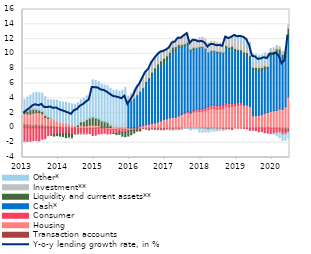
| Category | Transaction accounts | Housing | Consumer | Cash* | Liquidity and current assets** | Investment** | Other* |
|---|---|---|---|---|---|---|---|
| 2013-01-01 | 0.508 | 1.431 | -1.847 | 0 | 0.247 | -0.025 | 1.661 |
| 2013-02-01 | 0.453 | 1.445 | -1.828 | 0 | 0.347 | 0.059 | 1.858 |
| 2013-03-01 | 0.396 | 1.481 | -1.809 | 0 | 0.577 | 0.174 | 1.791 |
| 2013-04-01 | 0.363 | 1.611 | -1.729 | 0 | 0.524 | 0.158 | 2.057 |
| 2013-05-01 | 0.428 | 1.629 | -1.697 | 0 | 0.421 | 0.119 | 2.236 |
| 2013-06-01 | 0.354 | 1.679 | -1.76 | 0 | 0.356 | 0.073 | 2.298 |
| 2013-07-01 | 0.377 | 1.547 | -1.534 | 0 | 0.28 | 0.055 | 2.445 |
| 2013-08-01 | 0.277 | 1.122 | -1.451 | 0 | 0.273 | 0.107 | 2.436 |
| 2013-09-01 | 0.283 | 0.981 | -1.058 | 0 | 0.173 | 0.116 | 2.267 |
| 2013-10-01 | 0.296 | 0.993 | -0.949 | 0 | -0.033 | 0.081 | 2.425 |
| 2013-11-01 | 0.234 | 0.883 | -0.898 | 0 | -0.218 | 0.069 | 2.571 |
| 2013-12-01 | 0.178 | 0.692 | -0.843 | 0 | -0.202 | 0.115 | 2.751 |
| 2014-01-01 | 0.161 | 0.59 | -0.827 | 0 | -0.283 | 0.112 | 2.704 |
| 2014-02-01 | 0.047 | 0.58 | -0.791 | 0 | -0.379 | 0.1 | 2.763 |
| 2014-03-01 | 0.093 | 0.545 | -0.742 | 0 | -0.569 | 0.016 | 2.827 |
| 2014-04-01 | 0.086 | 0.425 | -0.769 | 0 | -0.554 | -0.011 | 2.841 |
| 2014-05-01 | -0.103 | 0.39 | -0.777 | 0 | -0.503 | -0.016 | 2.846 |
| 2014-06-01 | 0.02 | 0.27 | -0.77 | 0 | -0.102 | -0.004 | 2.917 |
| 2014-07-01 | -0.1 | 0.167 | -0.769 | 0 | 0.237 | -0.031 | 2.979 |
| 2014-08-01 | -0.098 | 0.395 | -0.748 | 0 | 0.414 | -0.032 | 3.01 |
| 2014-09-01 | -0.081 | 0.267 | -0.729 | 0 | 0.594 | -0.055 | 3.145 |
| 2014-10-01 | -0.149 | 0.302 | -0.669 | 0 | 0.817 | -0.022 | 3.213 |
| 2014-11-01 | -0.14 | 0.382 | -0.636 | 0 | 0.945 | 0.036 | 3.176 |
| 2014-12-01 | -0.096 | 0.404 | -0.93 | 0 | 1.047 | 0.02 | 5.023 |
| 2015-01-01 | -0.103 | 0.371 | -0.88 | 0 | 0.971 | 0.029 | 5.041 |
| 2015-02-01 | 0.049 | 0.294 | -0.837 | 0 | 0.885 | 0.01 | 4.996 |
| 2015-03-01 | 0.079 | 0.039 | -0.79 | 0 | 0.818 | 0.043 | 4.945 |
| 2015-04-01 | 0.097 | -0.029 | -0.7 | 0 | 0.733 | 0.112 | 4.846 |
| 2015-05-01 | 0.037 | -0.211 | -0.623 | 0 | 0.663 | 0.156 | 4.828 |
| 2015-06-01 | 0.048 | -0.237 | -0.564 | 0 | 0.273 | 0.217 | 4.827 |
| 2015-07-01 | 0.011 | -0.222 | -0.512 | 0 | -0.03 | 0.258 | 4.777 |
| 2015-08-01 | 0.06 | -0.235 | -0.472 | 0 | -0.202 | 0.254 | 4.784 |
| 2015-09-01 | -0.027 | -0.077 | -0.415 | 0 | -0.356 | 0.321 | 4.643 |
| 2015-10-01 | -0.034 | -0.17 | -0.385 | 0 | -0.533 | 0.409 | 4.662 |
| 2015-11-01 | 0.008 | -0.216 | -0.356 | 0 | -0.624 | 0.491 | 4.982 |
| 2015-12-01 | -0.089 | -0.265 | -0.024 | 3.632 | -0.722 | 0.632 | 0.016 |
| 2016-01-01 | -0.127 | -0.175 | -0.021 | 3.762 | -0.611 | 0.682 | 0.257 |
| 2016-02-01 | -0.043 | -0.189 | 0.001 | 4.013 | -0.457 | 0.748 | 0.372 |
| 2016-03-01 | -0.152 | 0.065 | 0.042 | 4.376 | -0.299 | 0.899 | 0.433 |
| 2016-04-01 | -0.291 | 0.194 | 0.05 | 4.714 | -0.12 | 0.918 | 0.433 |
| 2016-05-01 | -0.108 | 0.303 | 0.059 | 5.046 | 0.031 | 0.954 | 0.425 |
| 2016-06-01 | -0.176 | 0.432 | 0.056 | 5.656 | 0.139 | 0.962 | 0.437 |
| 2016-07-01 | -0.255 | 0.503 | 0.03 | 6.024 | 0.239 | 0.947 | 0.404 |
| 2016-08-01 | -0.154 | 0.606 | 0.004 | 6.623 | 0.307 | 0.957 | 0.426 |
| 2016-09-01 | -0.178 | 0.661 | -0.02 | 7.102 | 0.348 | 1.031 | 0.396 |
| 2016-10-01 | -0.176 | 0.793 | -0.055 | 7.461 | 0.394 | 1.006 | 0.414 |
| 2016-11-01 | -0.174 | 0.952 | -0.065 | 7.609 | 0.499 | 0.969 | 0.433 |
| 2016-12-01 | -0.201 | 1.131 | -0.045 | 7.685 | 0.596 | 0.886 | 0.263 |
| 2017-01-01 | -0.106 | 1.22 | -0.024 | 7.92 | 0.595 | 0.87 | 0.053 |
| 2017-02-01 | -0.207 | 1.343 | -0.03 | 8.279 | 0.584 | 0.861 | -0.029 |
| 2017-03-01 | -0.208 | 1.424 | -0.041 | 8.897 | 0.588 | 0.894 | -0.087 |
| 2017-04-01 | -0.152 | 1.419 | -0.038 | 9.037 | 0.509 | 0.925 | -0.101 |
| 2017-05-01 | -0.139 | 1.617 | -0.009 | 9.239 | 0.4 | 0.979 | 0.036 |
| 2017-06-01 | -0.149 | 1.807 | 0.026 | 9.09 | 0.33 | 1.082 | -0.071 |
| 2017-07-01 | -0.013 | 1.938 | 0.095 | 9.039 | 0.286 | 1.153 | -0.047 |
| 2017-08-01 | -0.026 | 2.037 | 0.187 | 9.028 | 0.319 | 1.239 | -0.048 |
| 2017-09-01 | -0.096 | 1.953 | 0.144 | 8.311 | 0.208 | 1.123 | -0.228 |
| 2017-10-01 | -0.014 | 2.157 | 0.238 | 8.209 | 0.241 | 1.163 | -0.142 |
| 2017-11-01 | -0.023 | 2.254 | 0.303 | 8.195 | 0.045 | 1.16 | -0.142 |
| 2017-12-01 | -0.056 | 2.205 | 0.311 | 8.33 | 0.09 | 1.26 | -0.508 |
| 2018-01-01 | -0.081 | 2.265 | 0.327 | 8.3 | 0.083 | 1.278 | -0.481 |
| 2018-02-01 | -0.113 | 2.34 | 0.369 | 7.965 | 0.047 | 1.301 | -0.424 |
| 2018-03-01 | -0.111 | 2.495 | 0.416 | 7.335 | -0.033 | 1.25 | -0.433 |
| 2018-04-01 | -0.081 | 2.649 | 0.463 | 7.33 | -0.002 | 1.282 | -0.359 |
| 2018-05-01 | -0.115 | 2.601 | 0.491 | 7.248 | 0.078 | 1.279 | -0.329 |
| 2018-06-01 | -0.166 | 2.547 | 0.505 | 7.138 | 0.143 | 1.197 | -0.261 |
| 2018-07-01 | -0.145 | 2.554 | 0.495 | 7.101 | 0.124 | 1.2 | -0.178 |
| 2018-08-01 | -0.225 | 2.647 | 0.474 | 6.992 | 0.092 | 1.178 | -0.137 |
| 2018-09-01 | -0.14 | 2.915 | 0.498 | 7.489 | 0.205 | 1.226 | 0.07 |
| 2018-10-01 | -0.125 | 2.846 | 0.442 | 7.456 | 0.158 | 1.193 | 0.104 |
| 2018-11-01 | -0.206 | 2.929 | 0.385 | 7.416 | 0.306 | 1.244 | 0.165 |
| 2018-12-01 | -0.005 | 3.009 | 0.366 | 7.096 | 0.257 | 1.224 | 0.559 |
| 2019-01-01 | -0.045 | 3.078 | 0.343 | 6.898 | 0.267 | 1.186 | 0.594 |
| 2019-02-01 | -0.024 | 3.175 | 0.284 | 6.823 | 0.273 | 1.178 | 0.658 |
| 2019-03-01 | -0.041 | 3.067 | -0.017 | 6.909 | 0.281 | 1.148 | 0.909 |
| 2019-04-01 | -0.041 | 3.102 | -0.071 | 6.728 | 0.35 | 0.959 | 0.944 |
| 2019-05-01 | -0.101 | 2.892 | -0.229 | 6.532 | 0.332 | 0.851 | 0.917 |
| 2019-06-01 | -0.032 | 1.641 | -0.277 | 6.225 | 0.324 | 0.815 | 0.995 |
| 2019-07-01 | -0.025 | 1.64 | -0.34 | 6.167 | 0.367 | 0.718 | 1.061 |
| 2019-08-01 | -0.025 | 1.693 | -0.499 | 6.043 | 0.38 | 0.64 | 1.02 |
| 2019-09-01 | 0.002 | 1.775 | -0.51 | 6.049 | 0.332 | 0.612 | 1.07 |
| 2019-10-01 | -0.05 | 1.982 | -0.601 | 6.001 | 0.376 | 0.64 | 1.136 |
| 2019-11-01 | 0.007 | 2.063 | -0.707 | 6.01 | 0.22 | 0.687 | 1.091 |
| 2019-12-01 | -0.045 | 2.247 | -0.705 | 7.459 | 0.31 | 0.604 | 0.11 |
| 2020-01-31 | -0.067 | 2.32 | -0.682 | 7.598 | 0.358 | 0.543 | -0.106 |
| 2020-02-29 | -0.05 | 2.357 | -0.646 | 7.878 | 0.431 | 0.481 | -0.343 |
| 2020-03-31 | -0.142 | 2.559 | -0.469 | 7.592 | 0.497 | 0.362 | -0.692 |
| 2020-04-30 | -0.391 | 2.519 | -0.482 | 6.976 | 0.428 | 0.428 | -0.806 |
| 2020-05-31 | -0.497 | 2.845 | -0.315 | 6.823 | 0.636 | 0.451 | -0.835 |
| 2020-06-30 | -0.368 | 4.188 | -0.212 | 7.993 | 1.298 | 0.472 | -0.813 |